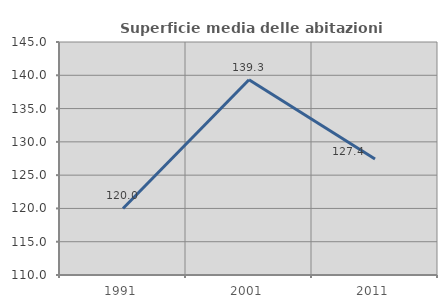
| Category | Superficie media delle abitazioni occupate |
|---|---|
| 1991.0 | 120 |
| 2001.0 | 139.333 |
| 2011.0 | 127.417 |